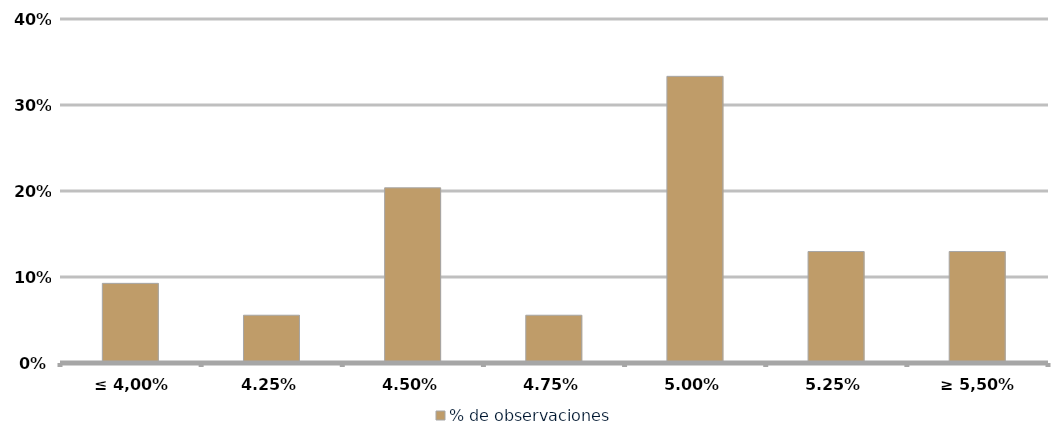
| Category | % de observaciones  |
|---|---|
| ≤ 4,00% | 0.093 |
| 4,25% | 0.056 |
| 4,50% | 0.204 |
| 4,75% | 0.056 |
| 5,00% | 0.333 |
| 5,25% | 0.13 |
| ≥ 5,50% | 0.13 |